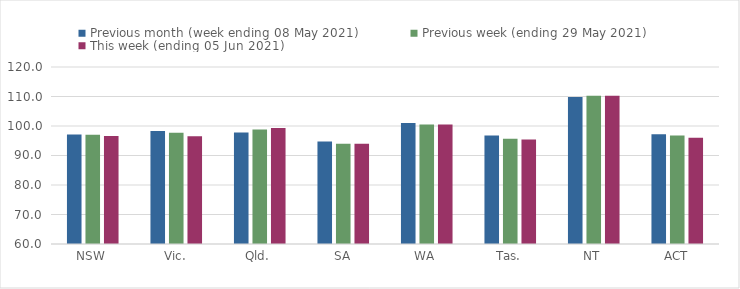
| Category | Previous month (week ending 08 May 2021) | Previous week (ending 29 May 2021) | This week (ending 05 Jun 2021) |
|---|---|---|---|
| NSW | 97.15 | 97.04 | 96.65 |
| Vic. | 98.32 | 97.74 | 96.56 |
| Qld. | 97.8 | 98.8 | 99.34 |
| SA | 94.77 | 94.01 | 94.01 |
| WA | 101.04 | 100.48 | 100.48 |
| Tas. | 96.76 | 95.64 | 95.45 |
| NT | 109.84 | 110.28 | 110.28 |
| ACT | 97.2 | 96.78 | 96.04 |